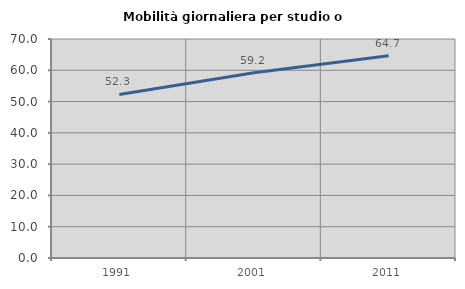
| Category | Mobilità giornaliera per studio o lavoro |
|---|---|
| 1991.0 | 52.279 |
| 2001.0 | 59.223 |
| 2011.0 | 64.656 |